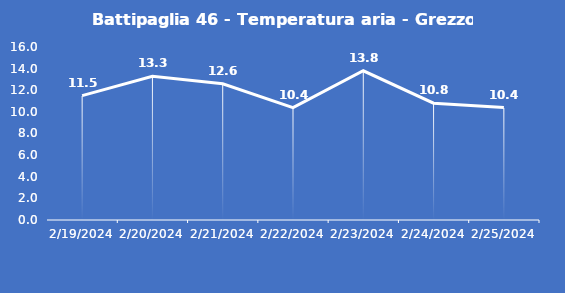
| Category | Battipaglia 46 - Temperatura aria - Grezzo (°C) |
|---|---|
| 2/19/24 | 11.5 |
| 2/20/24 | 13.3 |
| 2/21/24 | 12.6 |
| 2/22/24 | 10.4 |
| 2/23/24 | 13.8 |
| 2/24/24 | 10.8 |
| 2/25/24 | 10.4 |